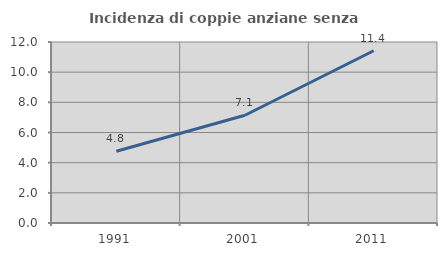
| Category | Incidenza di coppie anziane senza figli  |
|---|---|
| 1991.0 | 4.756 |
| 2001.0 | 7.143 |
| 2011.0 | 11.422 |